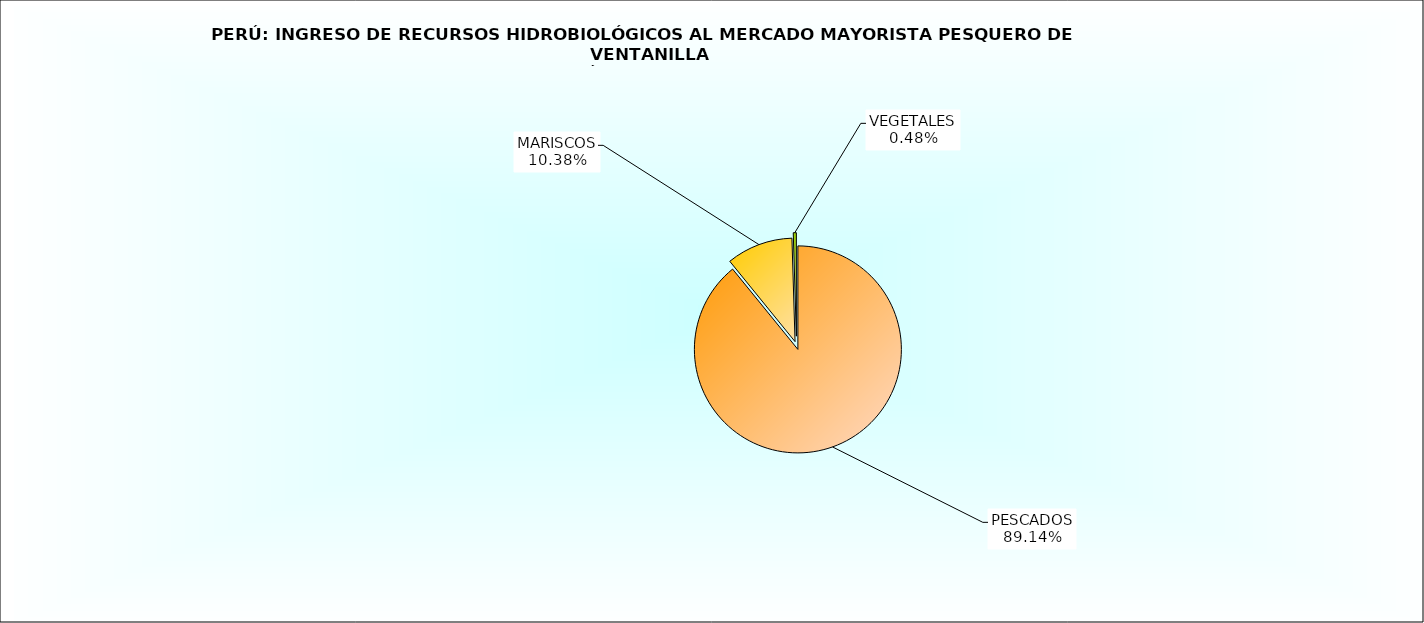
| Category | Series 0 |
|---|---|
| PESCADOS | 89.137 |
| MARISCOS | 10.383 |
| VEGETALES | 0.48 |